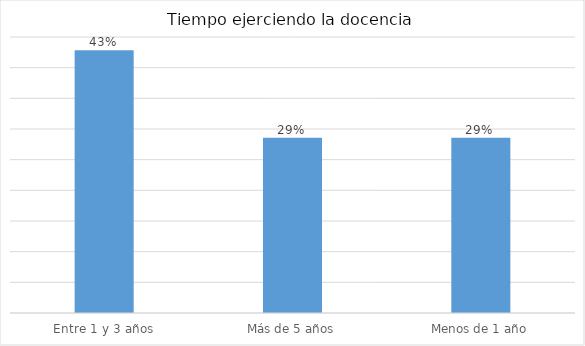
| Category | Series 0 |
|---|---|
| Entre 1 y 3 años | 0.429 |
| Más de 5 años | 0.286 |
| Menos de 1 año | 0.286 |